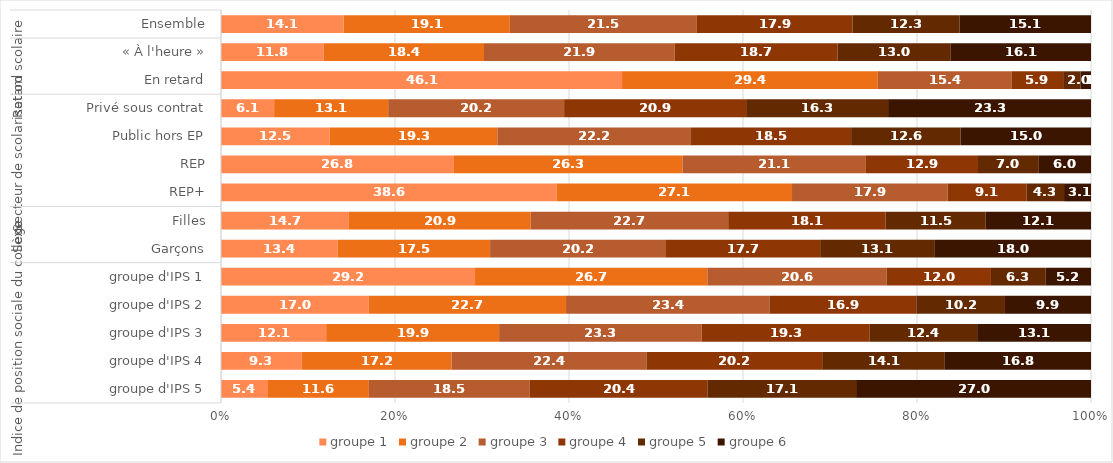
| Category | groupe 1 | groupe 2 | groupe 3 | groupe 4 | groupe 5 | groupe 6 |
|---|---|---|---|---|---|---|
| 0 | 14.1 | 19.1 | 21.5 | 17.9 | 12.3 | 15.1 |
| 1 | 11.8 | 18.4 | 21.9 | 18.7 | 13 | 16.1 |
| 2 | 46.1 | 29.4 | 15.4 | 5.9 | 2 | 1.2 |
| 3 | 6.1 | 13.1 | 20.2 | 20.9 | 16.3 | 23.3 |
| 4 | 12.5 | 19.3 | 22.2 | 18.5 | 12.6 | 15 |
| 5 | 26.8 | 26.3 | 21.1 | 12.9 | 7 | 6 |
| 6 | 38.6 | 27.1 | 17.9 | 9.1 | 4.3 | 3.1 |
| 7 | 14.7 | 20.9 | 22.7 | 18.1 | 11.5 | 12.1 |
| 8 | 13.4 | 17.5 | 20.2 | 17.7 | 13.1 | 18 |
| 9 | 29.2 | 26.7 | 20.6 | 12 | 6.3 | 5.2 |
| 10 | 17 | 22.7 | 23.4 | 16.9 | 10.2 | 9.9 |
| 11 | 12.1 | 19.9 | 23.3 | 19.3 | 12.4 | 13.1 |
| 12 | 9.3 | 17.2 | 22.4 | 20.2 | 14.1 | 16.8 |
| 13 | 5.4 | 11.6 | 18.5 | 20.4 | 17.1 | 27 |